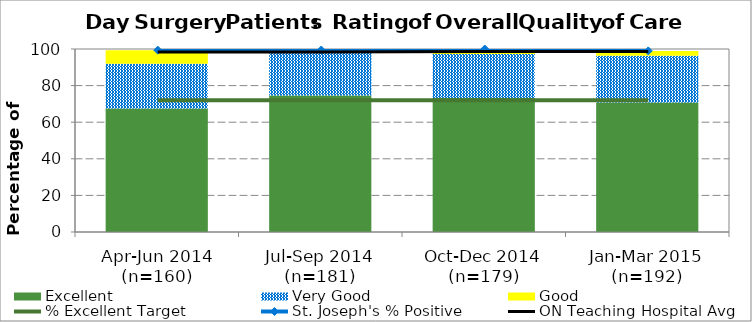
| Category | Excellent | Very Good | Good |
|---|---|---|---|
| Apr-Jun 2014 (n=160) | 67.5 | 24.38 | 7.5 |
| Jul-Sep 2014 (n=181) | 74.59 | 23.2 | 1.66 |
| Oct-Dec 2014 (n=179) | 73.18 | 24.02 | 2.79 |
| Jan-Mar 2015 (n=192) | 70.83 | 25.52 | 2.6 |